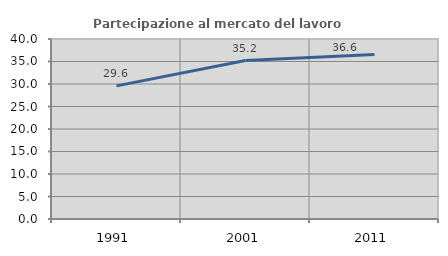
| Category | Partecipazione al mercato del lavoro  femminile |
|---|---|
| 1991.0 | 29.589 |
| 2001.0 | 35.207 |
| 2011.0 | 36.566 |